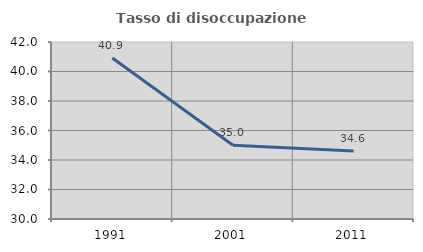
| Category | Tasso di disoccupazione giovanile  |
|---|---|
| 1991.0 | 40.909 |
| 2001.0 | 35 |
| 2011.0 | 34.615 |